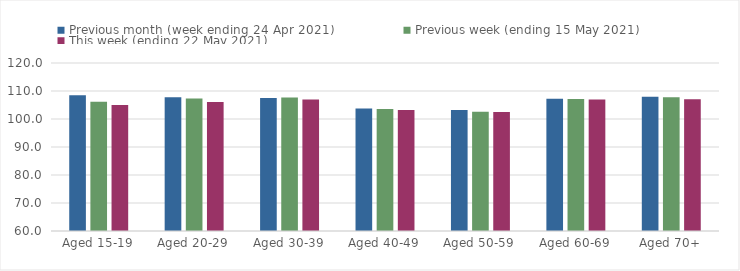
| Category | Previous month (week ending 24 Apr 2021) | Previous week (ending 15 May 2021) | This week (ending 22 May 2021) |
|---|---|---|---|
| Aged 15-19 | 108.48 | 106.14 | 105 |
| Aged 20-29 | 107.74 | 107.34 | 106.09 |
| Aged 30-39 | 107.46 | 107.65 | 107 |
| Aged 40-49 | 103.79 | 103.54 | 103.25 |
| Aged 50-59 | 103.24 | 102.6 | 102.51 |
| Aged 60-69 | 107.22 | 107.11 | 106.94 |
| Aged 70+ | 107.91 | 107.78 | 107.04 |